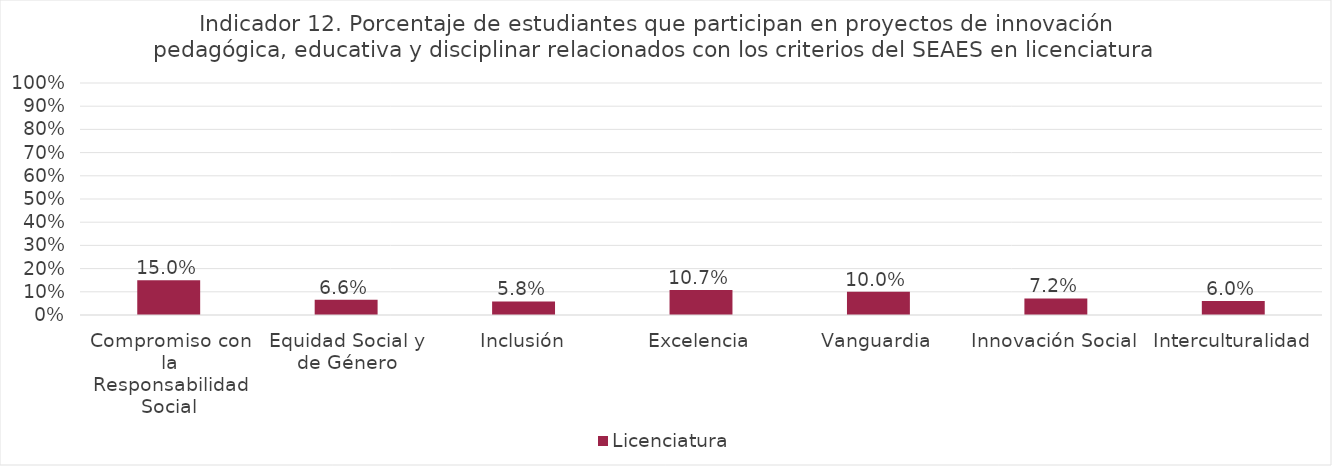
| Category | Licenciatura |
|---|---|
| Compromiso con la Responsabilidad Social | 0.15 |
| Equidad Social y de Género | 0.066 |
| Inclusión | 0.058 |
| Excelencia | 0.107 |
| Vanguardia | 0.1 |
| Innovación Social | 0.072 |
| Interculturalidad | 0.06 |